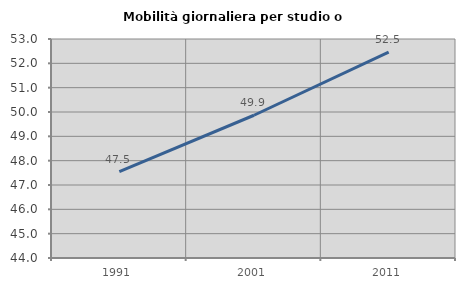
| Category | Mobilità giornaliera per studio o lavoro |
|---|---|
| 1991.0 | 47.548 |
| 2001.0 | 49.867 |
| 2011.0 | 52.459 |